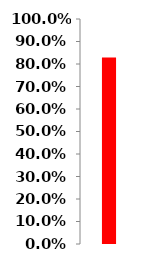
| Category | Series 0 |
|---|---|
| 0 | 0.829 |